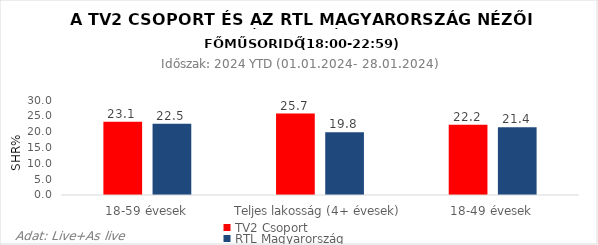
| Category | TV2 Csoport | RTL Magyarország |
|---|---|---|
| 18-59 évesek | 23.1 | 22.5 |
| Teljes lakosság (4+ évesek) | 25.7 | 19.8 |
| 18-49 évesek | 22.2 | 21.4 |